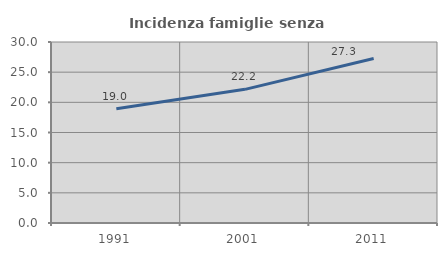
| Category | Incidenza famiglie senza nuclei |
|---|---|
| 1991.0 | 18.954 |
| 2001.0 | 22.154 |
| 2011.0 | 27.261 |